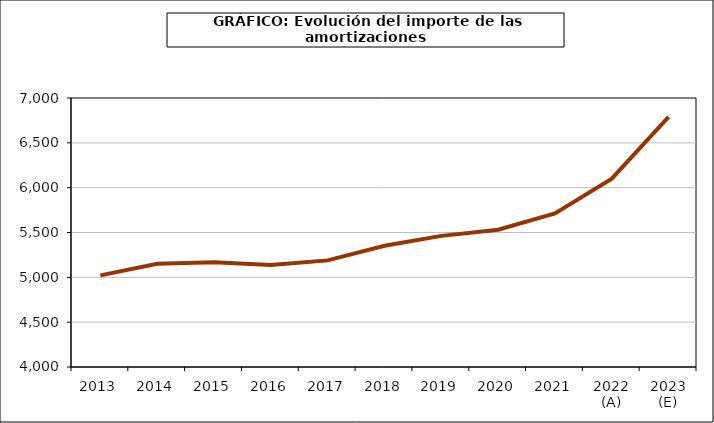
| Category | amortizacion |
|---|---|
| 2013 | 5021.523 |
| 2014 | 5151.042 |
| 2015 | 5167.348 |
| 2016 | 5137.515 |
| 2017 | 5189.174 |
| 2018 | 5351.475 |
| 2019 | 5462.515 |
| 2020 | 5530.73 |
| 2021 | 5712.019 |
| 2022 (A) | 6099.952 |
| 2023 (E) | 6790.368 |